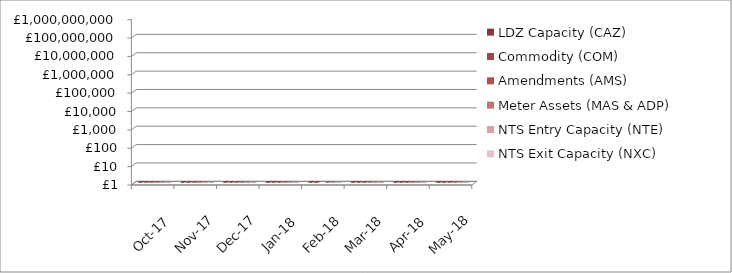
| Category | LDZ Capacity (CAZ) | Commodity (COM) | Amendments (AMS) | Meter Assets (MAS & ADP) | NTS Entry Capacity (NTE) | NTS Exit Capacity (NXC) |
|---|---|---|---|---|---|---|
| 2017-10-01 | 299201864.14 | 26855499.51 | 321543.98 | 193840.32 | 11176717.5 | 18097117.82 |
| 2017-11-01 | 290194555.87 | 41901625.24 | 281193.04 | 187587.95 | 12089719.21 | 18734838.83 |
| 2017-12-01 | 299923728.54 | 49314715.49 | 486751.91 | 193840.34 | 12089719.21 | 18734838.83 |
| 2018-01-01 | 300085873.04 | 51013861.41 | 398601 | 193840 | 13468961.26 | 18693319.21 |
| 2018-02-01 | 271243893.07 | 49577294.91 | -97584.69 | 175082.41 | 10887736.94 | 16944144.32 |
| 2018-03-01 | 300714752.62 | 47885458.16 | 435828.94 | 193565.33 | 12522228.64 | 16944144.32 |
| 2018-04-01 | 302200317.27 | 29034584.31 | 1543453.44 | 194233.3 | 1577511.57 | 18111359.22 |
| 2018-05-01 | 312174512.16 | 19449237 | 2024085.07 | 200707.08 | 1599795.55 | 18702620.75 |